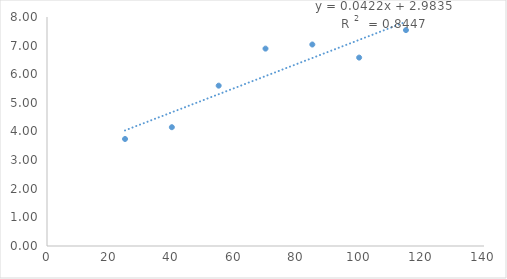
| Category | Series 0 |
|---|---|
| 25.0 | 3.739 |
| 40.0 | 4.15 |
| 55.0 | 5.601 |
| 70.0 | 6.895 |
| 85.0 | 7.039 |
| 100.0 | 6.582 |
| 115.0 | 7.542 |